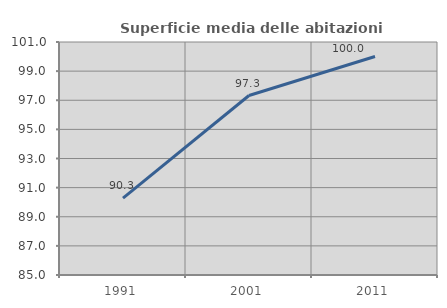
| Category | Superficie media delle abitazioni occupate |
|---|---|
| 1991.0 | 90.275 |
| 2001.0 | 97.324 |
| 2011.0 | 100.004 |